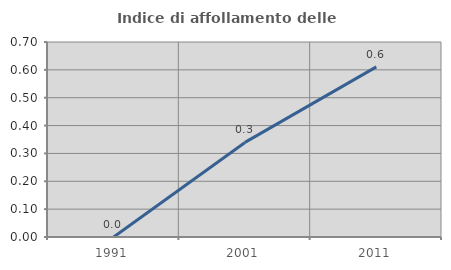
| Category | Indice di affollamento delle abitazioni  |
|---|---|
| 1991.0 | 0 |
| 2001.0 | 0.34 |
| 2011.0 | 0.611 |